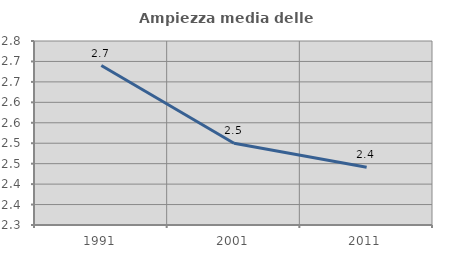
| Category | Ampiezza media delle famiglie |
|---|---|
| 1991.0 | 2.69 |
| 2001.0 | 2.5 |
| 2011.0 | 2.441 |